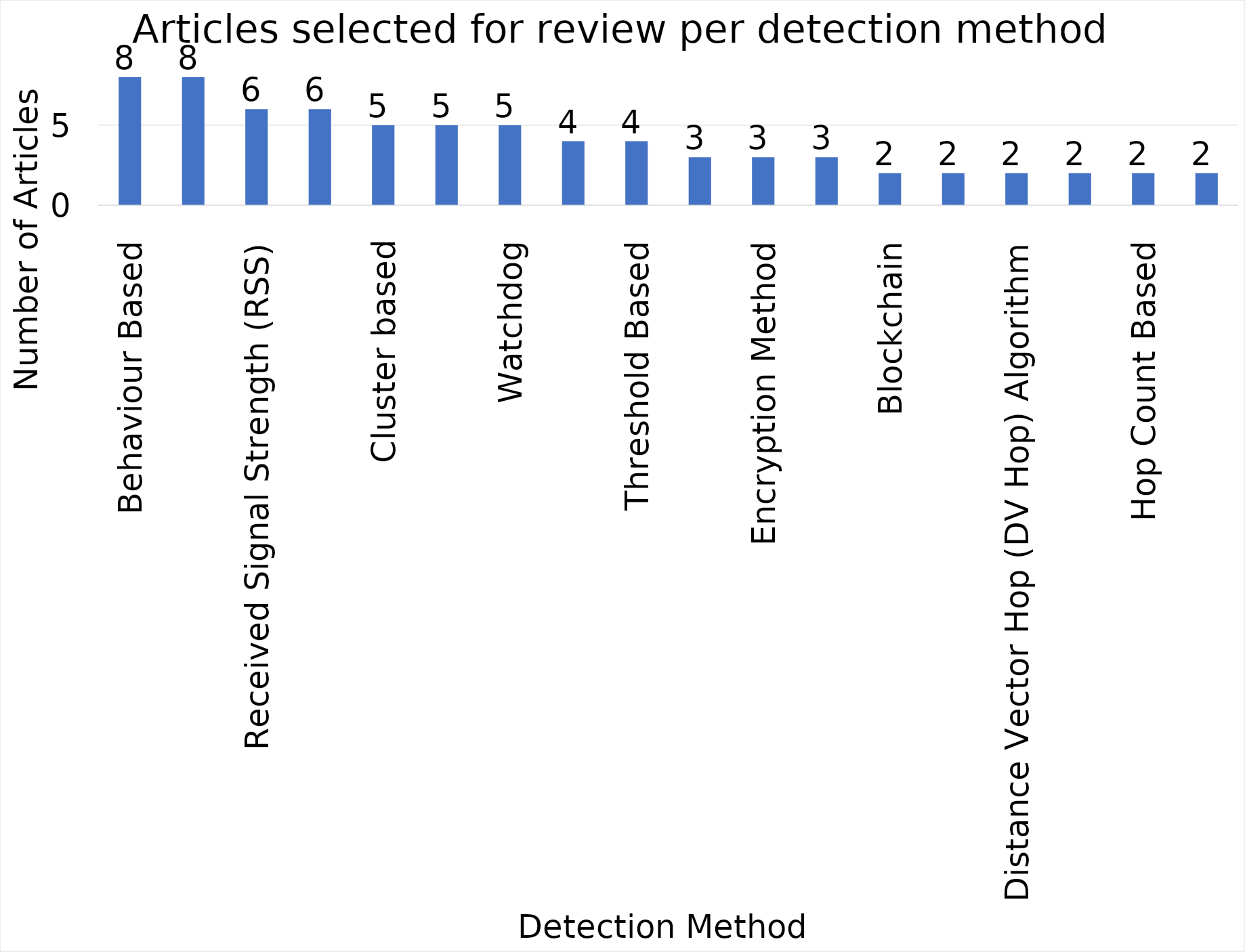
| Category | Papers |
|---|---|
| Behaviour Based | 8 |
| Neighbour Based | 8 |
| Received Signal Strength (RSS) | 6 |
| Trust Based | 6 |
| Cluster based | 5 |
| Signature Based | 5 |
| Watchdog | 5 |
| Network performance | 4 |
| Threshold Based | 4 |
| elliptic curve cryptography (ECC) | 3 |
| Encryption Method | 3 |
| Localization Based | 3 |
| Blockchain | 2 |
| deep learning | 2 |
| Distance Vector Hop (DV Hop) Algorithm | 2 |
| Genetic Algorithm (GA) | 2 |
| Hop Count Based | 2 |
| location information | 2 |